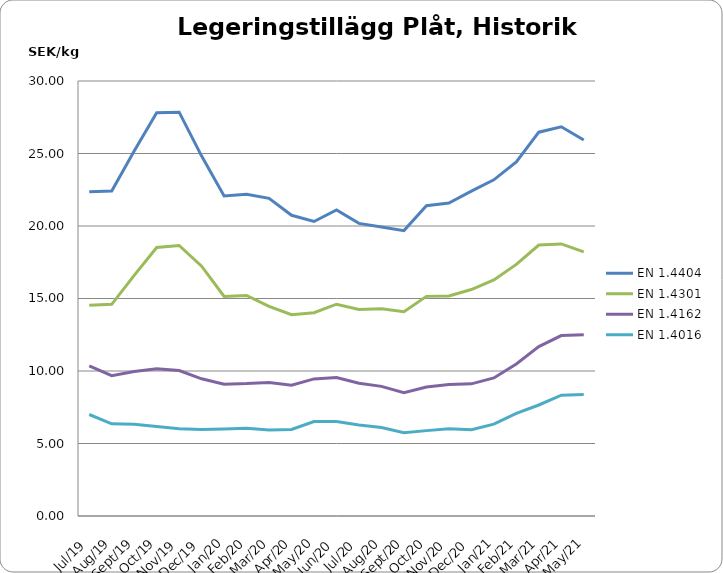
| Category | EN 1.4404 | EN 1.4301 | EN 1.4162  | EN 1.4016 |
|---|---|---|---|---|
| 2019-07-01 | 22.36 | 14.54 | 10.36 | 7 |
| 2019-08-01 | 22.42 | 14.6 | 9.68 | 6.36 |
| 2019-09-01 | 25.17 | 16.6 | 9.97 | 6.33 |
| 2019-10-01 | 27.81 | 18.52 | 10.16 | 6.18 |
| 2019-11-01 | 27.85 | 18.66 | 10.03 | 6.01 |
| 2019-12-01 | 24.82 | 17.23 | 9.46 | 5.97 |
| 2020-01-01 | 22.07 | 15.14 | 9.09 | 6 |
| 2020-02-01 | 22.19 | 15.21 | 9.13 | 6.05 |
| 2020-03-01 | 21.911 | 14.462 | 9.207 | 5.938 |
| 2020-04-01 | 20.74 | 13.88 | 9.02 | 5.97 |
| 2020-05-01 | 20.311 | 14.022 | 9.455 | 6.515 |
| 2020-06-01 | 21.105 | 14.607 | 9.554 | 6.524 |
| 2020-07-01 | 20.18 | 14.24 | 9.15 | 6.27 |
| 2020-08-01 | 19.932 | 14.286 | 8.939 | 6.099 |
| 2020-09-01 | 19.682 | 14.092 | 8.509 | 5.737 |
| 2020-10-01 | 21.4 | 15.147 | 8.892 | 5.888 |
| 2020-11-01 | 21.582 | 15.177 | 9.062 | 6.011 |
| 2020-12-01 | 22.402 | 15.617 | 9.115 | 5.945 |
| 2021-01-01 | 23.183 | 16.279 | 9.524 | 6.334 |
| 2021-02-01 | 24.425 | 17.354 | 10.488 | 7.077 |
| 2021-03-01 | 26.469 | 18.69 | 11.679 | 7.656 |
| 2021-04-01 | 26.842 | 18.766 | 12.443 | 8.336 |
| 2021-05-01 | 25.936 | 18.21 | 12.499 | 8.373 |